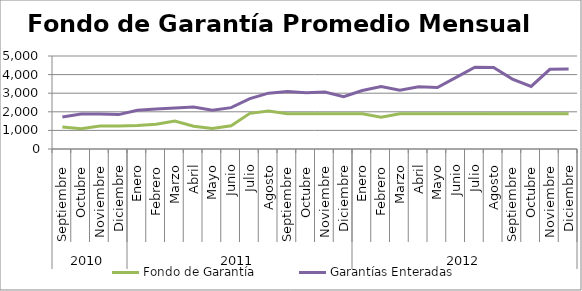
| Category | Fondo de Garantía | Garantías Enteradas |
|---|---|---|
| 0 | 1186.765 | 1723.136 |
| 1 | 1091.277 | 1878.561 |
| 2 | 1240.142 | 1886.493 |
| 3 | 1233.184 | 1848.941 |
| 4 | 1267.175 | 2079.773 |
| 5 | 1328.315 | 2151.804 |
| 6 | 1507.218 | 2200.488 |
| 7 | 1222.61 | 2253.818 |
| 8 | 1097.438 | 2081.441 |
| 9 | 1248.758 | 2223.666 |
| 10 | 1917.982 | 2706.525 |
| 11 | 2038.339 | 3002.384 |
| 12 | 1900.513 | 3095.395 |
| 13 | 1900.513 | 3029.373 |
| 14 | 1900.513 | 3060.179 |
| 15 | 1900.513 | 2809.042 |
| 16 | 1896.798 | 3141.641 |
| 17 | 1714.423 | 3362.648 |
| 18 | 1900.513 | 3154.118 |
| 19 | 1900.513 | 3348.058 |
| 20 | 1898.685 | 3308.859 |
| 21 | 1900.513 | 3850.375 |
| 22 | 1900.513 | 4400.539 |
| 23 | 1895.388 | 4383.327 |
| 24 | 1900.513 | 3757.632 |
| 25 | 1900.513 | 3362.932 |
| 26 | 1900.311 | 4285.609 |
| 27 | 1890.98 | 4296.87 |